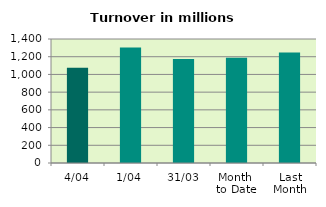
| Category | Series 0 |
|---|---|
| 4/04 | 1076.034 |
| 1/04 | 1303.394 |
| 31/03 | 1173.639 |
| Month 
to Date | 1189.714 |
| Last
Month | 1246.474 |